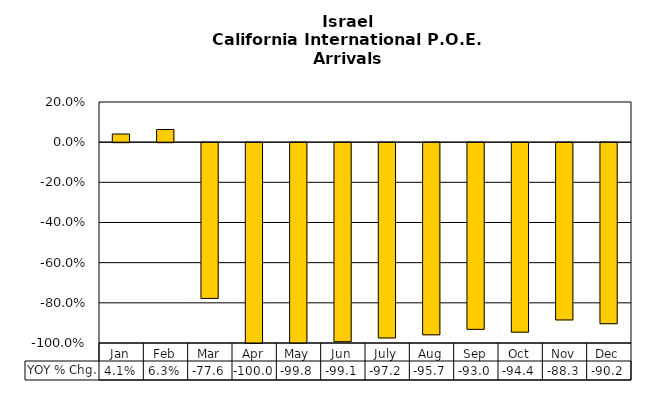
| Category | YOY % Chg. |
|---|---|
| Jan | 0.041 |
| Feb | 0.063 |
| Mar | -0.776 |
| Apr | -1 |
| May | -0.998 |
| Jun | -0.991 |
| July | -0.972 |
| Aug | -0.957 |
| Sep | -0.93 |
| Oct | -0.944 |
| Nov | -0.883 |
| Dec | -0.902 |